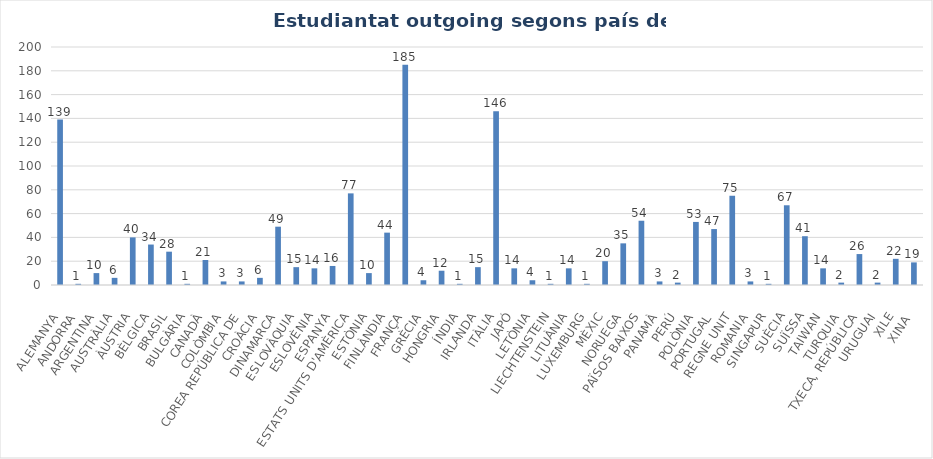
| Category | outgoing |
|---|---|
| ALEMANYA | 139 |
| ANDORRA | 1 |
| ARGENTINA | 10 |
| AUSTRÀLIA | 6 |
| ÀUSTRIA | 40 |
| BÈLGICA | 34 |
| BRASIL | 28 |
| BULGÀRIA | 1 |
| CANADÀ | 21 |
| COLÒMBIA | 3 |
| COREA REPÚBLICA DE | 3 |
| CROÀCIA | 6 |
| DINAMARCA | 49 |
| ESLOVÀQUIA | 15 |
| ESLOVÈNIA | 14 |
| ESPANYA | 16 |
| ESTATS UNITS D'AMÈRICA | 77 |
| ESTÒNIA | 10 |
| FINLÀNDIA | 44 |
| FRANÇA | 185 |
| GRÈCIA | 4 |
| HONGRIA | 12 |
| ÍNDIA | 1 |
| IRLANDA | 15 |
| ITÀLIA | 146 |
| JAPÓ | 14 |
| LETÒNIA | 4 |
| LIECHTENSTEIN | 1 |
| LITUÀNIA | 14 |
| LUXEMBURG | 1 |
| MÈXIC | 20 |
| NORUEGA | 35 |
| PAÏSOS BAIXOS | 54 |
| PANAMÀ | 3 |
| PERÚ | 2 |
| POLÒNIA | 53 |
| PORTUGAL | 47 |
| REGNE UNIT | 75 |
| ROMANIA | 3 |
| SINGAPUR | 1 |
| SUÈCIA | 67 |
| SUÏSSA | 41 |
| TAIWAN | 14 |
| TURQUIA | 2 |
| TXECA, REPÚBLICA | 26 |
| URUGUAI | 2 |
| XILE | 22 |
| XINA  | 19 |